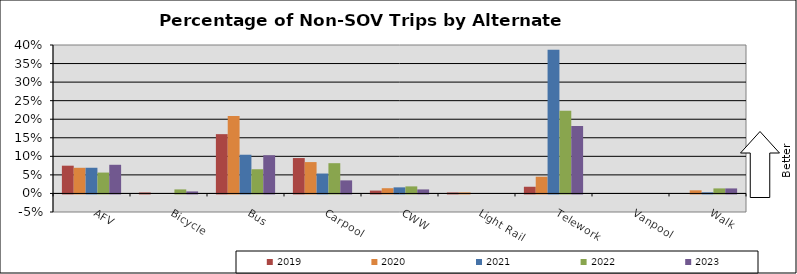
| Category | 2019 | 2020 | 2021 | 2022 | 2023 |
|---|---|---|---|---|---|
| AFV | 0.075 | 0.069 | 0.069 | 0.056 | 0.077 |
| Bicycle | 0.003 | 0 | 0 | 0.011 | 0.005 |
| Bus | 0.16 | 0.208 | 0.104 | 0.065 | 0.103 |
| Carpool | 0.095 | 0.085 | 0.054 | 0.082 | 0.035 |
| CWW | 0.008 | 0.014 | 0.016 | 0.019 | 0.011 |
| Light Rail | 0.003 | 0.003 | 0 | 0 | 0 |
| Telework | 0.018 | 0.045 | 0.387 | 0.223 | 0.182 |
| Vanpool | 0 | 0 | 0 | 0 | 0 |
| Walk | 0 | 0.008 | 0.003 | 0.014 | 0.014 |